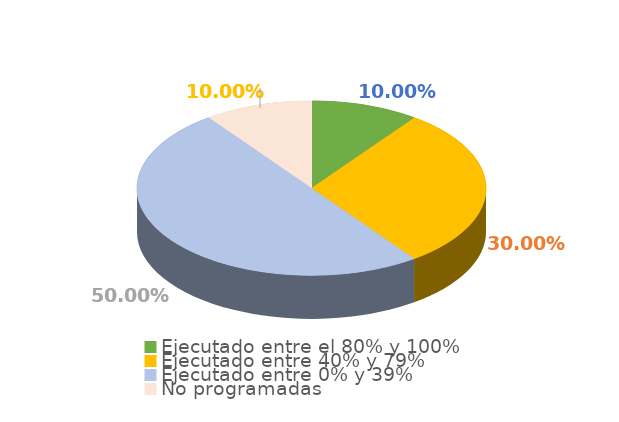
| Category | Series 0 |
|---|---|
| Ejecutado entre el 80% y 100% | 0.1 |
| Ejecutado entre 40% y 79% | 0.3 |
| Ejecutado entre 0% y 39% | 0.5 |
| No programadas | 0.1 |